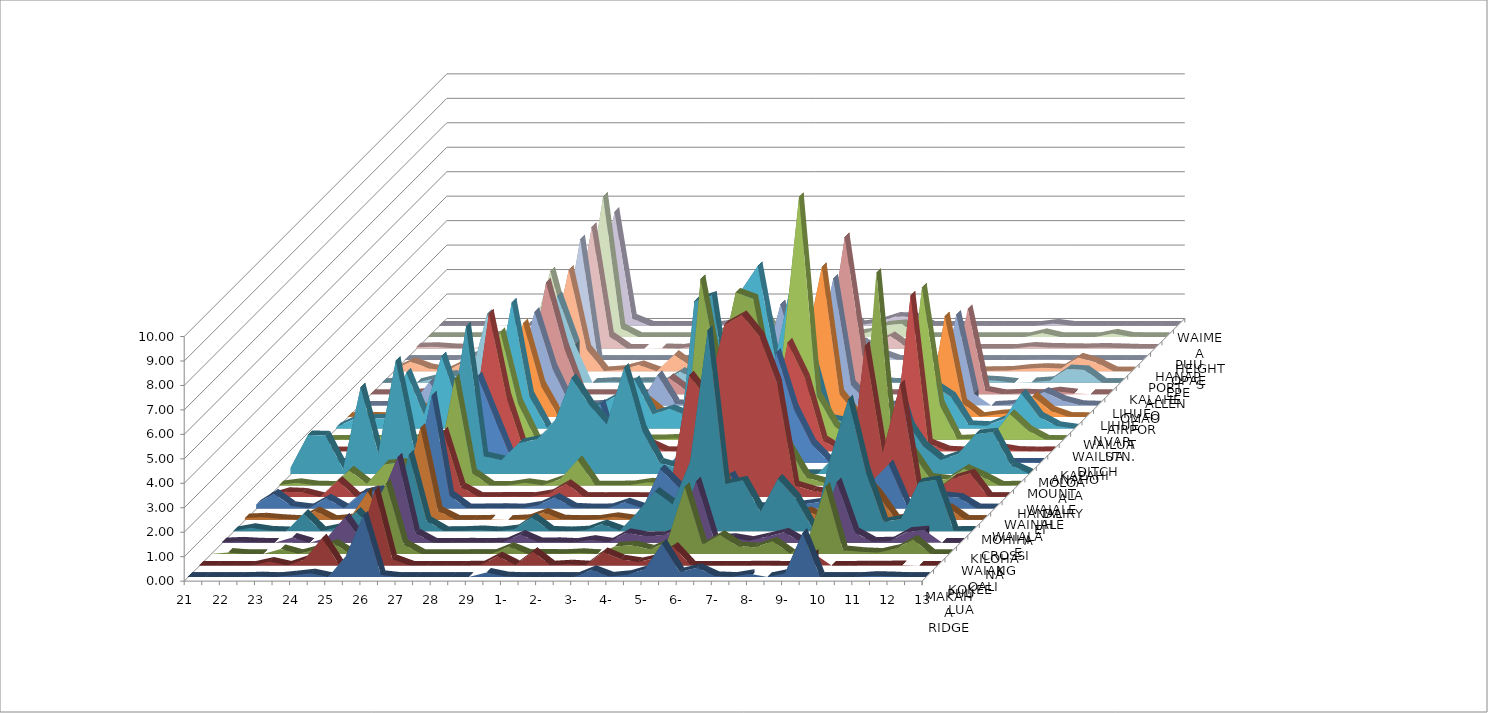
| Category | MAKAHA RIDGE | PUU LUA | KOKEE | WAIAKOALI | KILOHANA | MOHIHI CROSSING | WAIALAE | WAINIHA | HANALEI | MOUNT WAIALEALE | MOLOAA DAIRY | ANAHOLA | KAPAHI | N WAILUA DITCH | WAILUA | LIHUE VAR. STN. | LIHUE AIRPORT | OMAO | KALAHEO | PORT ALLEN | HANAPEPE | PUU OPAE | WAIMEA HEIGHTS |
|---|---|---|---|---|---|---|---|---|---|---|---|---|---|---|---|---|---|---|---|---|---|---|---|
| 2012-02-21 08:00:00 | 0 | 0 | 0 | 0.02 | 0.01 | 0.07 | 0.16 | 0 | 0.02 | 0.24 | 0 | 0 | 0 | 0.05 | 0 | 0 | 0 | 0 | 0.04 | 0 | 0.05 | 0 | 0 |
| 2012-02-21 20:00:00 | 0 | 0 | 0.06 | 0.05 | 0.14 | 0.1 | 0.61 | 0.21 | 0.11 | 1.6 | 0 | 0 | 0.01 | 0.38 | 0.03 | 0 | 0 | 0.01 | 0.39 | 0 | 0.07 | 0 | 0 |
| 2012-02-22 08:00:00 | 0 | 0 | 0 | 0.01 | 0.03 | 0.04 | 0.1 | 0.18 | 0.01 | 1.58 | 0 | 0 | 0 | 0.4 | 0 | 0.01 | 0 | 0 | 0.13 | 0 | 0.02 | 0 | 0 |
| 2012-02-22 20:00:00 | 0 | 0 | 0 | 0 | 0 | 0 | 0.01 | 0 | 0 | 0.21 | 0.01 | 0 | 0 | 0.41 | 0.02 | 0.02 | 0.07 | 0.18 | 0.01 | 0 | 0 | 0 | 0 |
| 2012-02-23 08:00:00 | 0.03 | 0.16 | 0.21 | 0.21 | 0.72 | 0.36 | 0.41 | 0.66 | 0.62 | 3.55 | 0 | 0.06 | 0.71 | 2.28 | 0.49 | 0.95 | 0.5 | 0.34 | 0.36 | 0.19 | 0.09 | 0.07 | 0.02 |
| 2012-02-23 20:00:00 | 0 | 0 | 0.01 | 0 | 0.01 | 0 | 0.01 | 0.01 | 0.07 | 0.84 | 0 | 0 | 0.02 | 0.55 | 0.01 | 0.01 | 0 | 0.04 | 0.03 | -0.19 | 0 | 0 | 0 |
| 2012-02-24 08:00:00 | 0.07 | 0.24 | 0.2 | 0.21 | 0.16 | 0.07 | 0.62 | 0.28 | 0.87 | 4.63 | 0 | 0 | 0.42 | 2.95 | 1.23 | 0.58 | 0 | 2.81 | 1.2 | 0.2 | 0.39 | 0.13 | 0.05 |
| 2012-02-24 20:00:00 | 0.15 | 1.11 | 0.43 | 1.03 | 0.8 | 1.15 | 0.76 | 0.22 | 0.94 | 1.16 | 0 | 0 | 0.01 | 0.85 | 0.03 | 0.02 | 0 | 0.01 | 0 | 0 | 0 | 2.69 | 0.42 |
| 2012-02-25 08:00:00 | 0 | 0 | 0 | 0 | 0 | 0 | 0.01 | 0 | 0 | 0 | 0.09 | 0.04 | 0 | 0 | 0 | 0 | 0 | 0 | 0 | 0 | 0 | 0 | 0 |
| 2012-02-25 20:00:00 | 0.84 | 0.68 | 1.46 | 1.75 | 0.77 | 1.07 | 1.25 | 0.44 | 0.62 | 1.48 | 0.41 | 0.54 | 0.68 | 1.24 | 0.83 | 1.03 | 0.55 | 0.83 | 0.88 | 0.79 | 0.78 | 1.19 | 0.9 |
| 2012-02-26 08:00:00 | 2.5 | 3.05 | 2.87 | 3.48 | 3.13 | 3.75 | 4.61 | 2.68 | 4.37 | 6.04 | 3.53 | 5.63 | 4.41 | 5.15 | 3.83 | 3.83 | 4.56 | 3.54 | 4.15 | 4.93 | 4.96 | 5.74 | 4.65 |
| 2012-02-26 20:00:00 | 0.08 | 0.26 | 0.39 | 0.39 | 0.42 | 0.36 | 0.53 | 0.4 | 0.5 | 0.73 | 1.76 | 2.2 | 1.5 | 1.32 | 1.29 | 1.54 | 1.96 | 1.57 | 0.9 | 0 | 0.49 | 0.36 | 0.29 |
| 2012-02-27 08:00:00 | 0 | 0 | 0 | 0 | 0.01 | 0 | 0 | 0.01 | 0 | 0.57 | 0.01 | 0 | 0.03 | 0.02 | 0.01 | 0.03 | 0 | 0 | 0.01 | 0 | 0 | 0 | 0 |
| 2012-02-27 20:00:00 | 0 | 0 | 0 | 0 | 0.02 | 0 | 0.01 | 0.01 | 0 | 1.27 | 0 | 0.01 | 0.01 | 0.67 | 0 | 0.02 | 0 | 0.04 | 0.07 | 0 | 0 | 0 | 0 |
| 2012-02-28 08:00:00 | 0 | 0 | 0 | 0.01 | 0.05 | 0.02 | 0.02 | 0.02 | 0.11 | 1.42 | 0 | 0 | 0.01 | 0.65 | 0.01 | 0.06 | 0 | 0.02 | 0.26 | 0 | 0.02 | 0 | 0 |
| 2012-02-28 20:00:00 | 0 | 0 | 0.01 | 0 | 0 | 0 | 0 | 0.01 | 0.01 | 2.07 | 0 | 0 | 0.07 | 0.96 | 0.01 | 0 | 0 | 0.04 | 0 | 0 | 0 | 0 | 0 |
| 2012-02-29 08:00:00 | 0 | 0.01 | 0.01 | 0.02 | 0.09 | 0.04 | 0.12 | 0.13 | 0.26 | 3.93 | 0.02 | 0.01 | 0.34 | 1.35 | 0.37 | 0.07 | 0 | 0.02 | 0.68 | 0.01 | 0.11 | 0 | 0.02 |
| 2012-02-29 20:00:00 | 0.18 | 0.38 | 0.3 | 0.33 | 0.56 | 0.3 | 0.44 | 0.54 | 1.04 | 2.84 | 2.41 | 0.26 | 1.14 | 1.98 | 0.66 | 1.25 | 0.67 | 0.45 | 0.16 | 0.03 | 0.2 | 0.36 | 0.17 |
| 2012-03-01 08:00:00 | 0.03 | 0.02 | 0.01 | 0.02 | 0.03 | 0.02 | 0.04 | 0.01 | 0.01 | 2.02 | 0.02 | 0.02 | 0.03 | 0.58 | 0.08 | 0.07 | 0.12 | 0.07 | 0.09 | 0.01 | 0.05 | 0.03 | 0.01 |
| 2012-03-01 20:00:00 | 0 | 0.56 | 0.02 | 0.03 | 0 | 0 | 0 | 0 | 0.01 | 4.35 | 0 | 0.34 | 0.03 | 0.8 | 0.05 | 0.02 | 0 | 0.14 | 0.1 | 0.03 | 0.77 | 1.06 | 0 |
| 2012-03-02 08:00:00 | 0 | 0.01 | 0.01 | 0 | 0.04 | 0.01 | 0.01 | 0.01 | 0.02 | 1.81 | 0.01 | 0.01 | 0.06 | 0.51 | 0 | 0.01 | 0 | 0.15 | 0.01 | 0 | 0.02 | 0 | 0 |
| 2012-03-02 20:00:00 | 0.01 | 0.05 | 0.05 | 0.12 | 0.29 | 0.12 | 0.25 | 0 | 0.13 | 0.47 | 0 | 0 | 0 | 0.11 | 0 | 0.03 | 0.07 | 0.01 | 0.02 | 0 | 0.13 | 0.09 | 0.06 |
| 2012-03-03 08:00:00 | 0 | 0.01 | 0 | 0.01 | 0.03 | 0.02 | 0.01 | 0 | 0.07 | 0.26 | 0.68 | 0.66 | 2.87 | 0.39 | 2.11 | 0.46 | 0.03 | 0 | 0 | 0 | 0 | 0 | 0 |
| 2012-03-03 20:00:00 | 0.29 | 0.55 | 0.31 | 0.4 | 0.78 | 0.52 | 1.61 | 0.63 | 0.62 | 7.07 | 0.78 | 1.37 | 1.89 | 5.58 | 2.24 | 1.42 | 0.44 | 0.28 | 0 | 1.36 | 1.16 | 1.8 | 0.72 |
| 2012-03-04 08:00:00 | 0.02 | 0.25 | 0.36 | 0.27 | 1.62 | 0.35 | 0.89 | 4.97 | 8.44 | 7.3 | 1.58 | 1.25 | 1.97 | 6.64 | 1.91 | 4.14 | 1.81 | 1.94 | 2.13 | 0.9 | 0.23 | 0.09 | 0.03 |
| 2012-03-04 20:00:00 | 0.09 | 0.14 | 0.19 | 0.28 | 1.09 | 0.23 | 0.26 | 4.03 | 4.63 | 2.51 | 1.05 | 1.28 | 2.17 | 2.8 | 2.48 | 1.72 | 1.8 | 0.83 | 0.41 | 0 | 0.08 | 0.18 | 0.14 |
| 2012-03-05 08:00:00 | 0.3 | 0.31 | 0.49 | 0.53 | 2.84 | 0.65 | 1 | 7.04 | 7.89 | 5.88 | 1.35 | 0.71 | 3.08 | 6.3 | 2.64 | 1.75 | 1.67 | 0.52 | 0.35 | 0.74 | 0.14 | 0.47 | 0.37 |
| 2012-03-05 20:00:00 | 1.36 | 0.77 | 2.74 | 2.51 | 8.21 | 2.44 | 1.35 | 7.44 | 7.63 | 4.51 | 4.49 | 4.44 | 9.93 | 3.05 | 6.13 | 5.19 | 6.42 | 1.29 | 0.51 | 0.27 | 0.51 | 0.54 | 0.35 |
| 2012-03-06 08:00:00 | 0.2 | 0 | 0.38 | 0.15 | 1.93 | 0.22 | 0.08 | 6.56 | 3.85 | 0.67 | 2.2 | 2.96 | 1.8 | 0.4 | 0.94 | 0.85 | 1.62 | 0.09 | 0.01 | 0.01 | 0 | 0 | 0 |
| 2012-03-06 20:00:00 | 0.37 | 0 | 0.79 | 0.2 | 2.08 | 0.15 | 0.06 | 4.65 | 1.54 | 0 | 0.77 | 0.45 | 0.57 | 0.26 | 0.03 | 0.08 | 0 | 0.01 | 0 | 0 | 0.04 | 0 | 0 |
| 2012-03-07 08:00:00 | 0.04 | 0 | 0.32 | 0.08 | 0.8 | 0.14 | 0.09 | 0.47 | 0.33 | 0 | 0.03 | 0 | 0.02 | 0.02 | 0 | 0 | 0 | 0 | 0 | 0 | 0 | 0 | 0 |
| 2012-03-07 20:00:00 | 0.01 | 0 | 0.28 | 0.24 | 2.15 | 0.18 | 0.15 | 0.25 | 0.12 | 0.73 | 0.01 | 0.02 | 0.54 | 0.27 | 0.06 | 0.07 | 0 | 0 | 0 | 0 | 0 | 0 | 0 |
| 2012-03-08 08:00:00 | 0.13 | 0.01 | 0.52 | 0.42 | 1.35 | 0.36 | 0.25 | 0.14 | 0.04 | 0.59 | 0.01 | 0 | 0.63 | 0.18 | 0.19 | 0.18 | 0.01 | 0 | 0 | 0 | 0 | 0 | 0 |
| 2012-03-08 20:00:00 | 0 | 0 | 0.01 | 0.02 | 0.06 | 0.02 | 0.02 | 0 | 0 | 0.05 | 0.01 | 0 | 0.01 | 0 | 0.01 | 0.01 | 0 | 0 | 0 | 0 | 0 | 0 | 0 |
| 2012-03-09 08:00:00 | 0.15 | 0 | 0.57 | 0.42 | 3.06 | 0.55 | 0.16 | 6.17 | 8.71 | 1.35 | 2.91 | 6.37 | 6.23 | 1.76 | 4.12 | 3.71 | 3.49 | 0.12 | 0.02 | 0 | 0 | 0 | 0 |
| 2012-03-09 20:00:00 | 1.8 | 0.49 | 2.74 | 2.47 | 5.39 | 1.85 | 1.07 | 1.78 | 1.11 | 2.21 | 0.52 | 0.32 | 1.44 | 1.29 | 0.56 | 0.49 | 0.14 | 0.08 | 0.03 | 0 | 0.08 | 0.17 | 0.09 |
| 2012-03-10 08:00:00 | 0 | 0 | 0.16 | 0.43 | 2.42 | 1.05 | 1.8 | 4.61 | 1.38 | 1.15 | 0.05 | 0.04 | 0.02 | 0.14 | 0.01 | 0 | 0 | 0 | 0.11 | 0.01 | 0.04 | 0 | 0 |
| 2012-03-10 20:00:00 | 0 | 0 | 0.09 | 0.04 | 0.38 | 0.04 | 0.15 | 0.33 | 0.32 | 0.58 | 0.05 | 0 | 0.05 | 0.11 | 0.11 | 0.04 | 0.04 | 0.03 | 0.15 | 0.01 | 0.03 | 0 | 0 |
| 2012-03-11 08:00:00 | 0 | 0.01 | 0.06 | 0.06 | 0.5 | 0.09 | 0.14 | 0.22 | 0.24 | 0.82 | 0.02 | 0 | 0.15 | 0.39 | 0.16 | 0.18 | 0.01 | 0.08 | 0.12 | 0 | 0.02 | 0 | 0 |
| 2012-03-11 20:00:00 | 0.05 | 0.01 | 0.22 | 0.45 | 1.99 | 0.29 | 0.51 | 0.76 | 0.69 | 1.64 | 0.15 | 0.14 | 1.06 | 1.43 | 0.85 | 0.57 | 0.12 | 0.56 | 0.57 | 0 | 0.04 | 0.15 | 0 |
| 2012-03-12 08:00:00 | 0.03 | 0.02 | 0.6 | 0.51 | 2.1 | 0.49 | 0.43 | 0.97 | 0.37 | 1.71 | 0 | 0.02 | 0.39 | 0.48 | 0.26 | 0.22 | 0.04 | 0.52 | 0.36 | 0 | 0.02 | 0.01 | 0 |
| 2012-03-12 20:00:00 | 0 | 0 | 0 | 0 | 0.02 | 0 | 0 | 0.01 | 0 | 0.36 | 0.01 | 0 | 0.01 | 0.1 | 0.01 | 0.03 | 0 | 0 | 0 | 0 | 0 | 0 | 0 |
| 2012-03-13 08:00:00 | 0 | 0 | 0 | 0 | 0.03 | 0 | 0 | 0.01 | 0.01 | 0.04 | 0 | 0.01 | 0 | 0 | 0 | 0.01 | 0 | 0 | 0 | 0 | 0 | 0 | 0 |